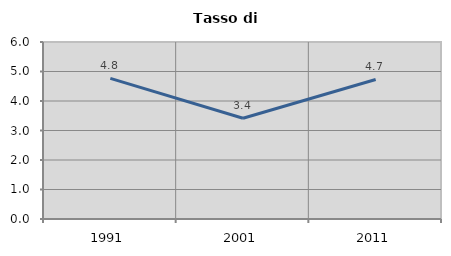
| Category | Tasso di disoccupazione   |
|---|---|
| 1991.0 | 4.767 |
| 2001.0 | 3.416 |
| 2011.0 | 4.729 |